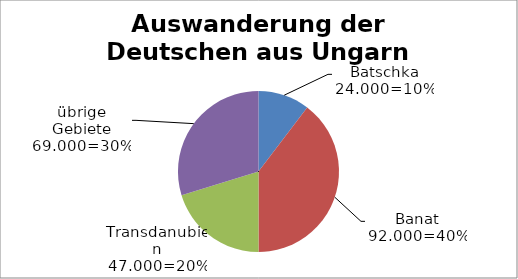
| Category | Series 0 |
|---|---|
| Batschka | 24000 |
| Banat | 92000 |
| Transdanubien | 47000 |
| übrige Gebiete | 69000 |